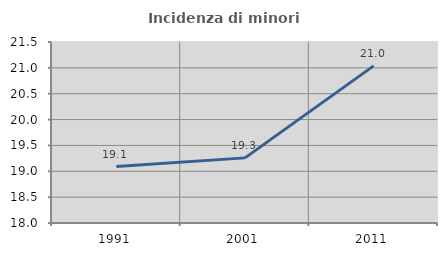
| Category | Incidenza di minori stranieri |
|---|---|
| 1991.0 | 19.091 |
| 2001.0 | 19.259 |
| 2011.0 | 21.039 |